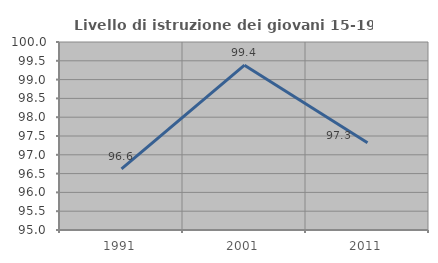
| Category | Livello di istruzione dei giovani 15-19 anni |
|---|---|
| 1991.0 | 96.624 |
| 2001.0 | 99.383 |
| 2011.0 | 97.321 |